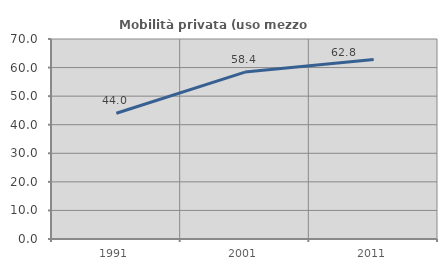
| Category | Mobilità privata (uso mezzo privato) |
|---|---|
| 1991.0 | 44.023 |
| 2001.0 | 58.42 |
| 2011.0 | 62.804 |